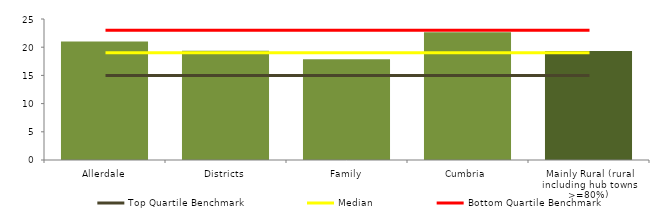
| Category | Block Data |
|---|---|
| Allerdale | 21 |
| Districts | 19.388 |
| Family | 17.875 |
| Cumbria | 22.667 |
| Mainly Rural (rural including hub towns >=80%)  | 19.304 |